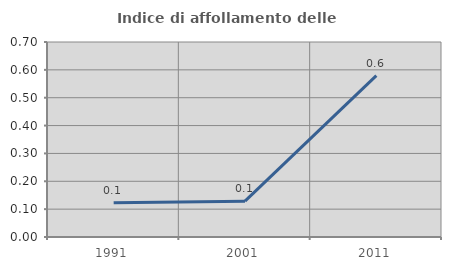
| Category | Indice di affollamento delle abitazioni  |
|---|---|
| 1991.0 | 0.123 |
| 2001.0 | 0.129 |
| 2011.0 | 0.579 |